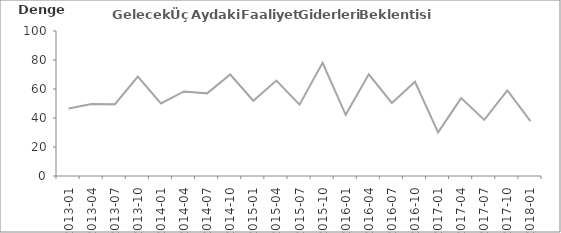
| Category | Gelecek Üç Aydaki Faaliyet Giderleri Beklentisi |
|---|---|
| 2013-01 | 46.5 |
| 2013-04 | 49.6 |
| 2013-07 | 49.4 |
| 2013-10 | 68.6 |
| 2014-01 | 50 |
| 2014-04 | 58.3 |
| 2014-07 | 57 |
| 2014-10 | 70 |
| 2015-01 | 51.9 |
| 2015-04 | 65.8 |
| 2015-07 | 49.2 |
| 2015-10 | 78.1 |
| 2016-01 | 42.2 |
| 2016-04 | 70.1 |
| 2016-07 | 50.4 |
| 2016-10 | 65 |
| 2017-01 | 30.1 |
| 2017-04 | 53.7 |
| 2017-07 | 38.7 |
| 2017-10 | 59.1 |
| 2018-01 | 37.8 |